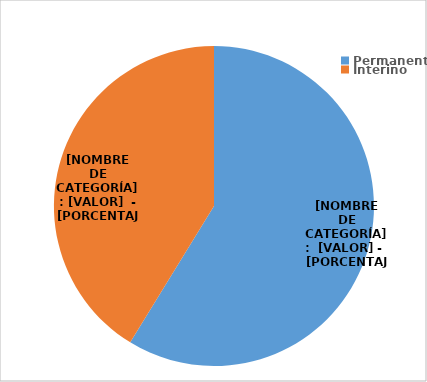
| Category | Series 0 |
|---|---|
| Permanente | 3254 |
| Interino | 2283 |